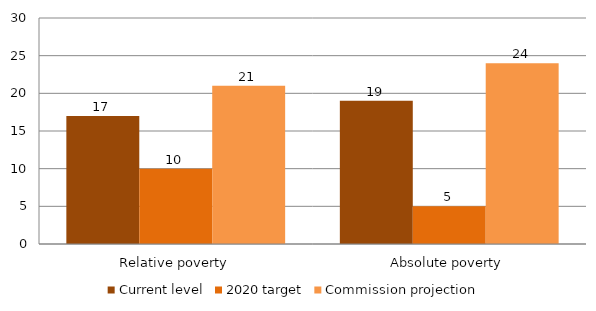
| Category | Current level | 2020 target | Commission projection  |
|---|---|---|---|
| Relative poverty | 17 | 10 | 21 |
| Absolute poverty | 19 | 5 | 24 |